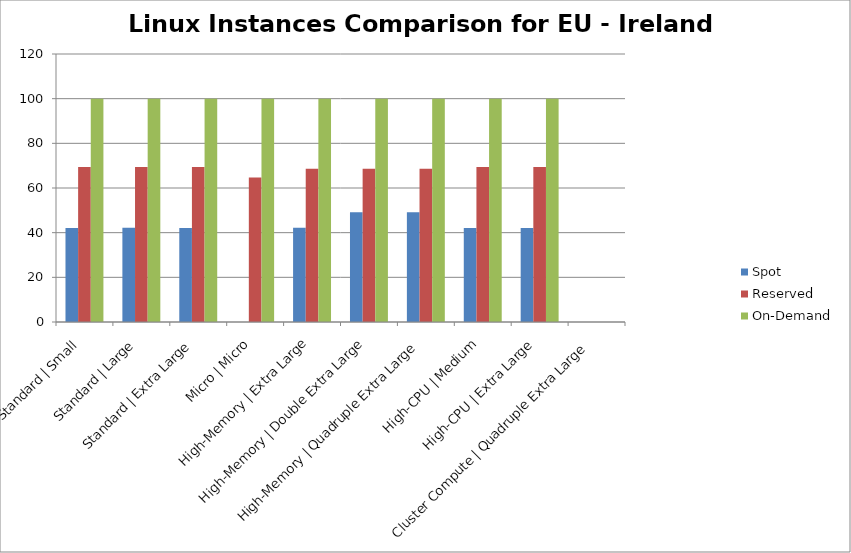
| Category | Spot | Reserved | On-Demand |
|---|---|---|---|
| Standard | Small | 42.076 | 69.442 | 100 |
| Standard | Large | 42.211 | 69.442 | 100 |
| Standard | Extra Large | 42.088 | 69.442 | 100 |
| Micro | Micro | 0 | 64.658 | 100 |
| High-Memory | Extra Large | 42.152 | 68.641 | 100 |
| High-Memory | Double Extra Large | 49.171 | 68.641 | 100 |
| High-Memory | Quadruple Extra Large | 49.142 | 68.641 | 100 |
| High-CPU | Medium | 42.09 | 69.442 | 100 |
| High-CPU | Extra Large | 42.135 | 69.442 | 100 |
| Cluster Compute | Quadruple Extra Large | 0 | 0 | 0 |